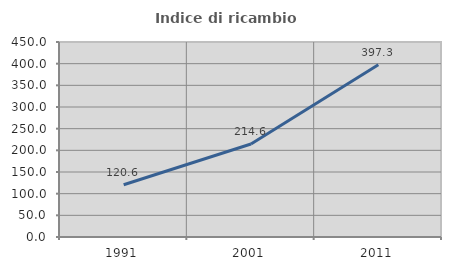
| Category | Indice di ricambio occupazionale  |
|---|---|
| 1991.0 | 120.588 |
| 2001.0 | 214.583 |
| 2011.0 | 397.297 |